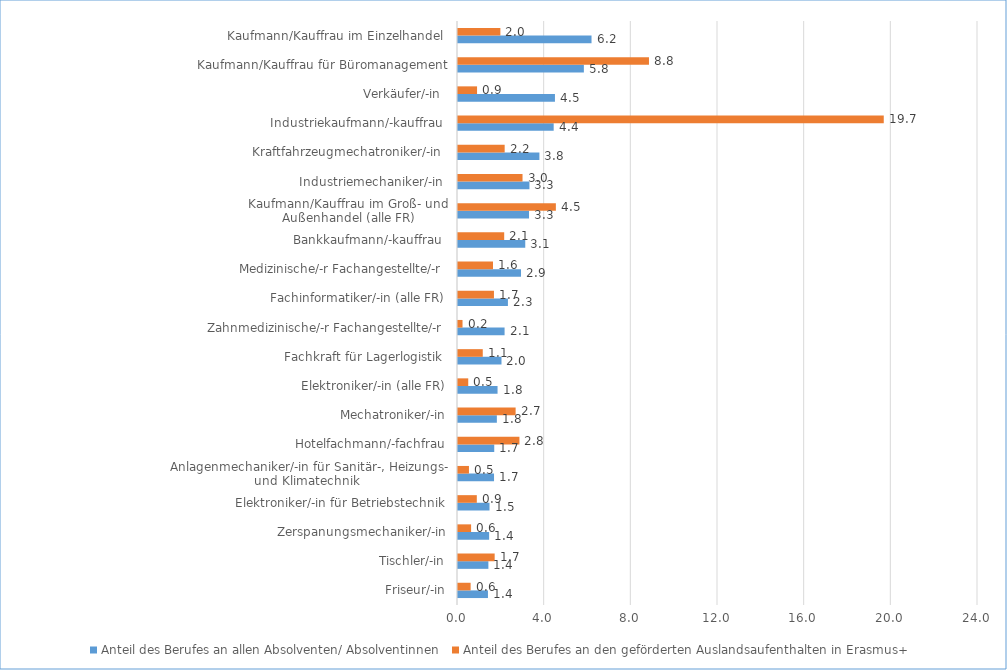
| Category | Anteil des Berufes an allen Absolventen/ Absolventinnen | Anteil des Berufes an den geförderten Auslandsaufenthalten in Erasmus+  |
|---|---|---|
| Friseur/-in | 1.383 | 0.582 |
| Tischler/-in | 1.403 | 1.692 |
| Zerspanungsmechaniker/-in | 1.437 | 0.604 |
| Elektroniker/-in für Betriebstechnik | 1.454 | 0.868 |
| Anlagenmechaniker/-in für Sanitär-, Heizungs- und Klimatechnik  | 1.663 | 0.506 |
| Hotelfachmann/-fachfrau | 1.673 | 2.835 |
| Mechatroniker/-in | 1.793 | 2.66 |
| Elektroniker/-in (alle FR) | 1.825 | 0.473 |
| Fachkraft für Lagerlogistik  | 2.007 | 1.143 |
| Zahnmedizinische/-r Fachangestellte/-r  | 2.15 | 0.209 |
| Fachinformatiker/-in (alle FR) | 2.304 | 1.66 |
| Medizinische/-r Fachangestellte/-r  | 2.908 | 1.616 |
| Bankkaufmann/-kauffrau  | 3.104 | 2.132 |
| Kaufmann/Kauffrau im Groß- und Außenhandel (alle FR) | 3.278 | 4.517 |
| Industriemechaniker/-in  | 3.298 | 2.978 |
| Kraftfahrzeugmechatroniker/-in  | 3.757 | 2.154 |
| Industriekaufmann/-kauffrau  | 4.416 | 19.651 |
| Verkäufer/-in  | 4.475 | 0.879 |
| Kaufmann/Kauffrau für Büromanagement | 5.809 | 8.814 |
| Kaufmann/Kauffrau im Einzelhandel  | 6.163 | 1.956 |